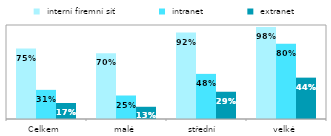
| Category |  interní firemní síť  |  intranet  |  extranet |
|---|---|---|---|
| Celkem | 0.75 | 0.31 | 0.17 |
| malé | 0.7 | 0.25 | 0.13 |
| střední  | 0.92 | 0.48 | 0.29 |
| velké | 0.98 | 0.8 | 0.44 |